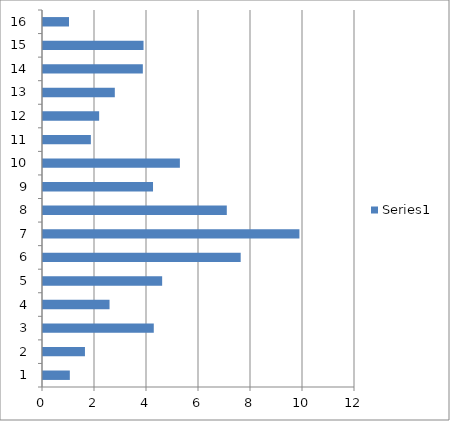
| Category | Series 0 |
|---|---|
| 0 | 1.032 |
| 1 | 1.614 |
| 2 | 4.261 |
| 3 | 2.559 |
| 4 | 4.583 |
| 5 | 7.603 |
| 6 | 9.862 |
| 7 | 7.069 |
| 8 | 4.232 |
| 9 | 5.265 |
| 10 | 1.841 |
| 11 | 2.159 |
| 12 | 2.762 |
| 13 | 3.84 |
| 14 | 3.867 |
| 15 | 1 |